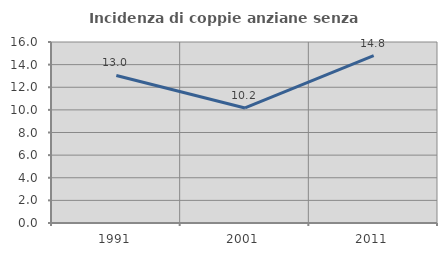
| Category | Incidenza di coppie anziane senza figli  |
|---|---|
| 1991.0 | 13.043 |
| 2001.0 | 10.169 |
| 2011.0 | 14.793 |